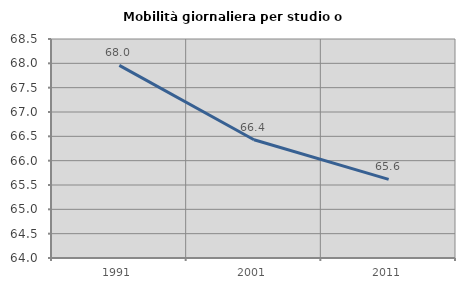
| Category | Mobilità giornaliera per studio o lavoro |
|---|---|
| 1991.0 | 67.959 |
| 2001.0 | 66.431 |
| 2011.0 | 65.616 |